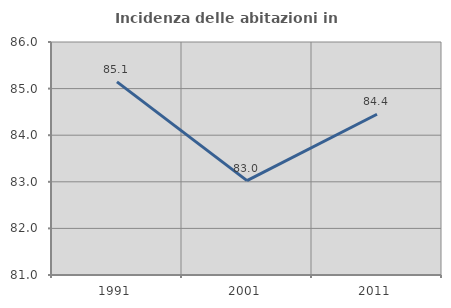
| Category | Incidenza delle abitazioni in proprietà  |
|---|---|
| 1991.0 | 85.145 |
| 2001.0 | 83.025 |
| 2011.0 | 84.45 |